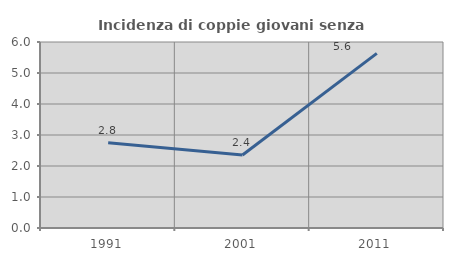
| Category | Incidenza di coppie giovani senza figli |
|---|---|
| 1991.0 | 2.752 |
| 2001.0 | 2.353 |
| 2011.0 | 5.634 |